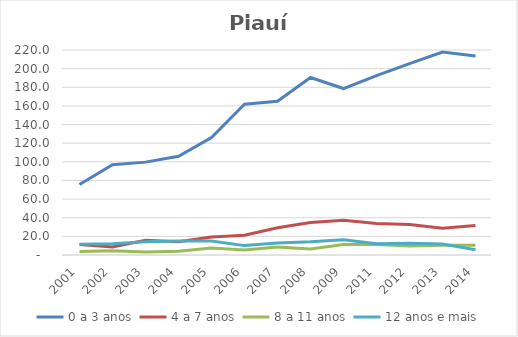
| Category | 0 a 3 anos | 4 a 7 anos | 8 a 11 anos | 12 anos e mais |
|---|---|---|---|---|
| 2001.0 | 75.728 | 11.22 | 3.763 | 11.605 |
| 2002.0 | 96.784 | 8.487 | 4.624 | 12.071 |
| 2003.0 | 99.661 | 15.876 | 3.264 | 14.144 |
| 2004.0 | 105.99 | 14.157 | 4.13 | 15.108 |
| 2005.0 | 126.149 | 19.356 | 7.629 | 14.956 |
| 2006.0 | 161.889 | 21.107 | 5.295 | 10.073 |
| 2007.0 | 164.963 | 29.199 | 8.654 | 12.856 |
| 2008.0 | 190.48 | 34.762 | 6.413 | 14.108 |
| 2009.0 | 178.645 | 37.236 | 11.327 | 16.269 |
| 2011.0 | 192.401 | 33.735 | 11.243 | 11.997 |
| 2012.0 | 205.439 | 32.761 | 9.667 | 12.573 |
| 2013.0 | 217.726 | 28.778 | 10.437 | 11.735 |
| 2014.0 | 213.547 | 31.727 | 10.366 | 5.726 |